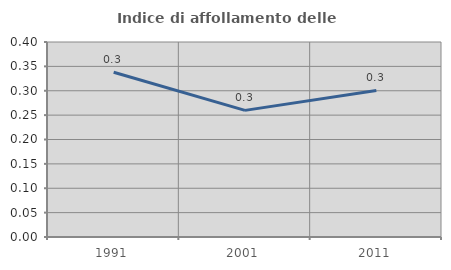
| Category | Indice di affollamento delle abitazioni  |
|---|---|
| 1991.0 | 0.338 |
| 2001.0 | 0.26 |
| 2011.0 | 0.301 |